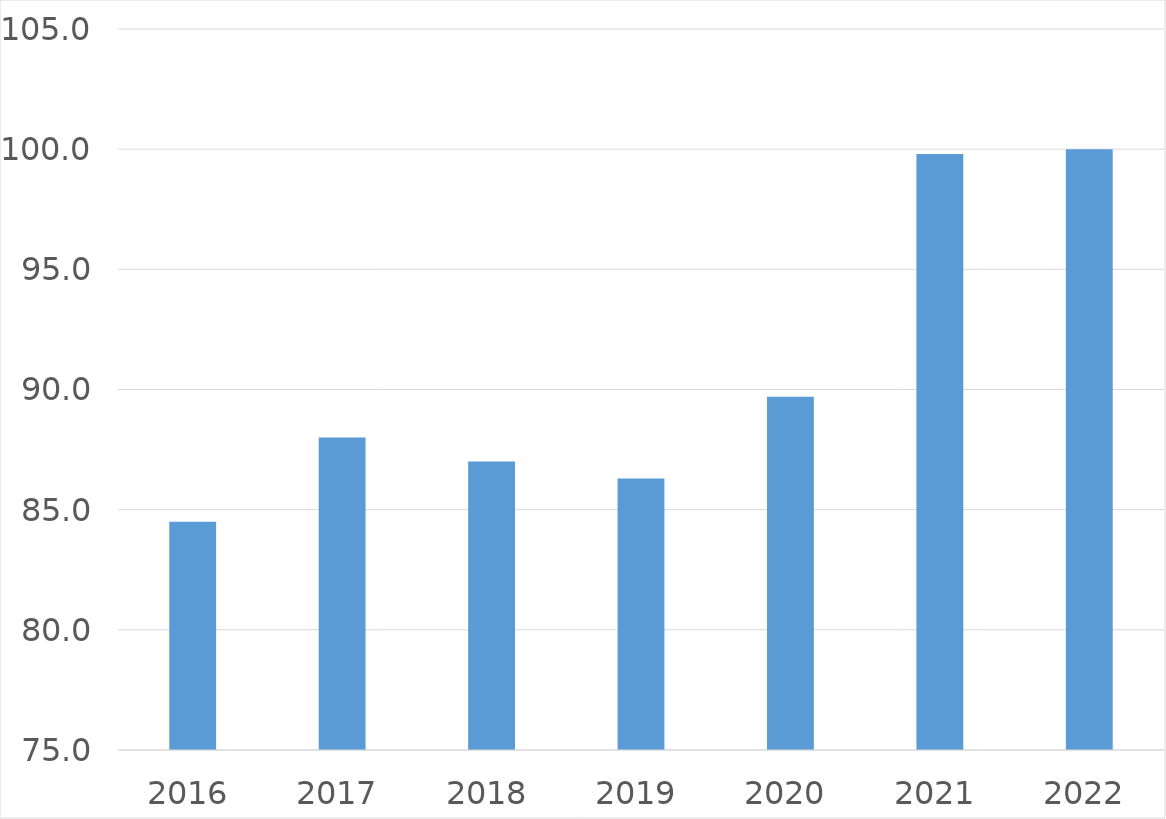
| Category | Series 0 |
|---|---|
| 2016 | 84.5 |
| 2017 | 88 |
| 2018 | 87 |
| 2019 | 86.3 |
| 2020 | 89.7 |
| 2021 | 99.8 |
| 2022 | 100 |